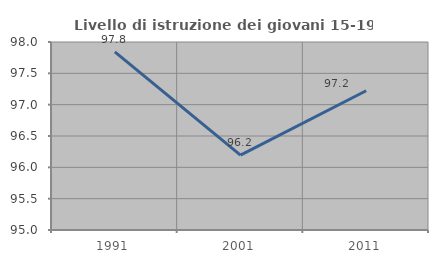
| Category | Livello di istruzione dei giovani 15-19 anni |
|---|---|
| 1991.0 | 97.842 |
| 2001.0 | 96.196 |
| 2011.0 | 97.222 |